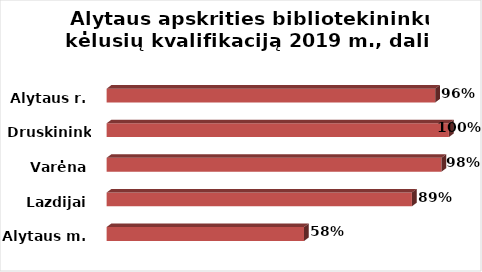
| Category | Series 0 |
|---|---|
| Alytaus m. | 0.577 |
| Lazdijai | 0.892 |
| Varėna | 0.978 |
| Druskininkai | 1 |
| Alytaus r. | 0.96 |